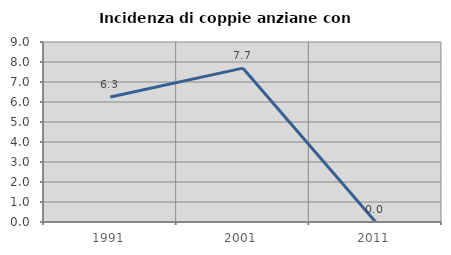
| Category | Incidenza di coppie anziane con figli |
|---|---|
| 1991.0 | 6.25 |
| 2001.0 | 7.692 |
| 2011.0 | 0 |